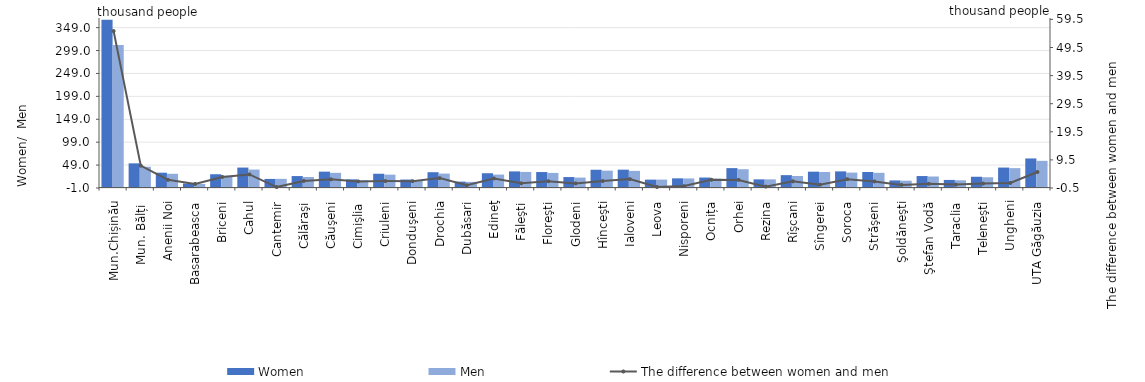
| Category | Women | Men |
|---|---|---|
| Mun.Chișinău | 366.405 | 311.051 |
| Mun. Bălți  | 52.798 | 45.357 |
| Anenii Noi | 32.41 | 30.012 |
| Basarabeasca | 8.857 | 7.923 |
| Briceni | 29.009 | 25.59 |
| Cahul | 43.589 | 39.259 |
| Cantemir | 18.828 | 18.994 |
| Călăraşi | 25.051 | 23.04 |
| Căuşeni | 34.688 | 32.104 |
| Cimişlia | 17.848 | 15.999 |
| Criuleni | 30.096 | 28.137 |
| Donduşeni | 17.46 | 15.523 |
| Drochia | 33.472 | 30.454 |
| Dubăsari | 12.888 | 12.408 |
|  Edineţ | 31.225 | 28.328 |
| Făleşti | 35.231 | 34.052 |
| Floreşti | 33.834 | 31.917 |
| Glodeni | 22.866 | 21.721 |
| Hînceşti | 38.833 | 36.86 |
| Ialoveni | 39.015 | 36.347 |
| Leova | 17.241 | 17.372 |
| Nisporeni | 20.041 | 19.862 |
| Ocnița | 21.82 | 19.393 |
| Orhei | 42.376 | 40.001 |
| Rezina | 17.854 | 17.859 |
| Rîşcani | 27.051 | 25.166 |
| Sîngerei | 34.617 | 33.936 |
| Soroca | 35.266 | 32.615 |
| Străşeni | 33.913 | 32.084 |
| Şoldăneşti | 15.524 | 14.923 |
| Ştefan Vodă | 25.091 | 24.113 |
| Taraclia | 16.588 | 15.883 |
| Teleneşti | 23.541 | 22.456 |
| Ungheni | 43.599 | 42.318 |
| UTA Găgăuzia | 63.467 | 58.28 |